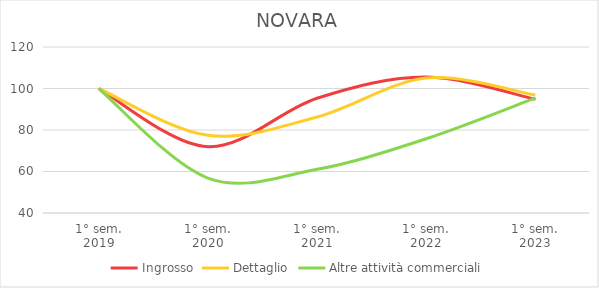
| Category | Ingrosso | Dettaglio | Altre attività commerciali |
|---|---|---|---|
| 1° sem.
2019 | 100 | 100 | 100 |
| 1° sem.
2020 | 71.934 | 77.462 | 56.842 |
| 1° sem.
2021 | 95.283 | 86.284 | 61.053 |
| 1° sem.
2022 | 105.542 | 105.015 | 75.789 |
| 1° sem.
2023 | 94.811 | 96.858 | 95.439 |